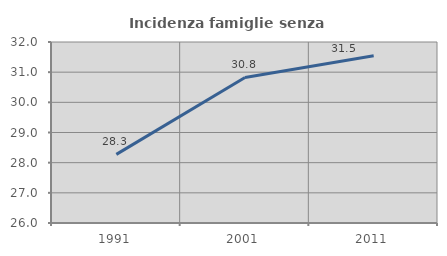
| Category | Incidenza famiglie senza nuclei |
|---|---|
| 1991.0 | 28.276 |
| 2001.0 | 30.825 |
| 2011.0 | 31.546 |